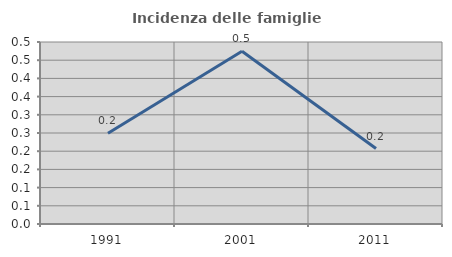
| Category | Incidenza delle famiglie numerose |
|---|---|
| 1991.0 | 0.249 |
| 2001.0 | 0.474 |
| 2011.0 | 0.207 |